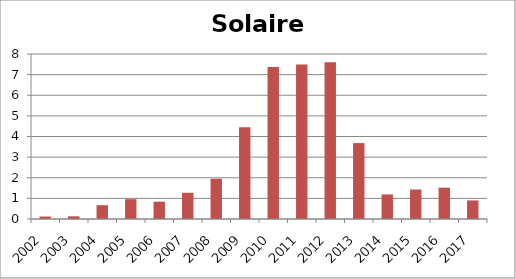
| Category | Solaire PV |
|---|---|
| 2002.0 | 0.12 |
| 2003.0 | 0.13 |
| 2004.0 | 0.67 |
| 2005.0 | 0.96 |
| 2006.0 | 0.84 |
| 2007.0 | 1.27 |
| 2008.0 | 1.95 |
| 2009.0 | 4.45 |
| 2010.0 | 7.37 |
| 2011.0 | 7.49 |
| 2012.0 | 7.6 |
| 2013.0 | 3.68 |
| 2014.0 | 1.19 |
| 2015.0 | 1.43 |
| 2016.0 | 1.52 |
| 2017.0 | 0.9 |